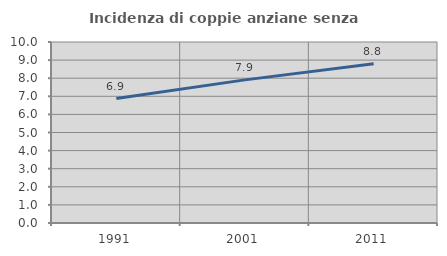
| Category | Incidenza di coppie anziane senza figli  |
|---|---|
| 1991.0 | 6.874 |
| 2001.0 | 7.907 |
| 2011.0 | 8.799 |